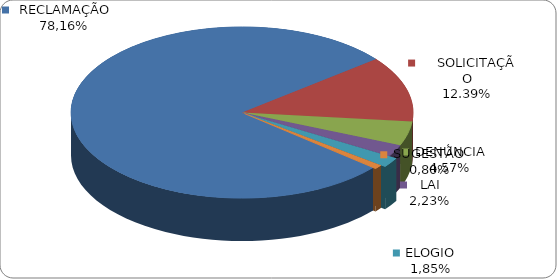
| Category | Series 0 |
|---|---|
|      RECLAMAÇÃO | 0.782 |
|      SOLICITAÇÃO | 0.124 |
|      DENÚNCIA | 0.046 |
|      LAI | 0.022 |
|      ELOGIO | 0.018 |
|      SUGESTÃO | 0.008 |